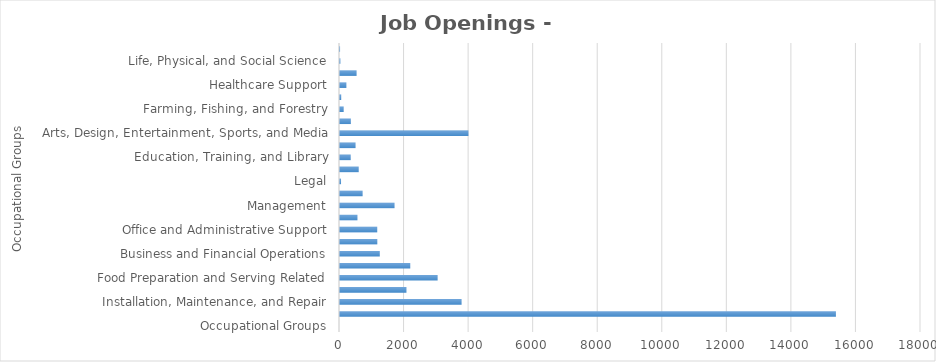
| Category | Series1 |
|---|---|
| Occupational Groups | 0 |
| Construction and Extraction | 15364 |
| Installation, Maintenance, and Repair | 3767 |
| Building and Grounds Cleaning and Maintenance | 2059 |
| Food Preparation and Serving Related | 3025 |
| Personal Care and Service | 2177 |
| Business and Financial Operations | 1233 |
| Sales and Related | 1156 |
| Office and Administrative Support | 1154 |
| Architecture and Engineering | 541 |
| Management | 1690 |
| Transportation and Material Moving | 701 |
| Legal | 32 |
| Healthcare Practitioners and Technical | 580 |
| Education, Training, and Library | 332 |
| Production | 482 |
| Arts, Design, Entertainment, Sports, and Media | 3979 |
| Computer and Mathematical | 336 |
| Farming, Fishing, and Forestry | 114 |
| Community and Social Services | 38 |
| Healthcare Support | 198 |
| Protective Service | 514 |
| Life, Physical, and Social Science | 12 |
| Military Specific  | 2 |